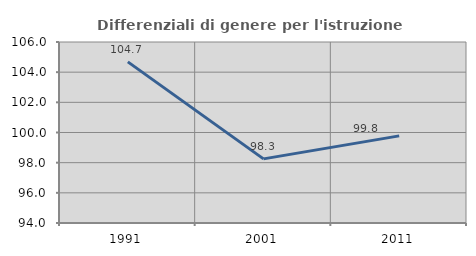
| Category | Differenziali di genere per l'istruzione superiore |
|---|---|
| 1991.0 | 104.682 |
| 2001.0 | 98.252 |
| 2011.0 | 99.776 |